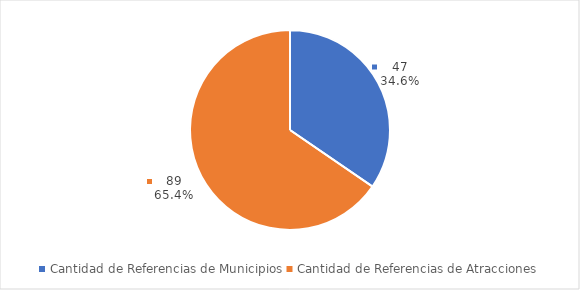
| Category | Series 0 |
|---|---|
| Cantidad de Referencias de Municipios | 47 |
| Cantidad de Referencias de Atracciones | 89 |